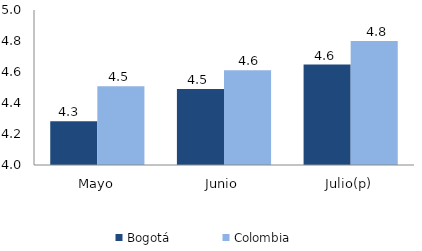
| Category | Bogotá | Colombia |
|---|---|---|
| Mayo | 4.282 | 4.507 |
| Junio | 4.49 | 4.611 |
| Julio(p) | 4.648 | 4.799 |